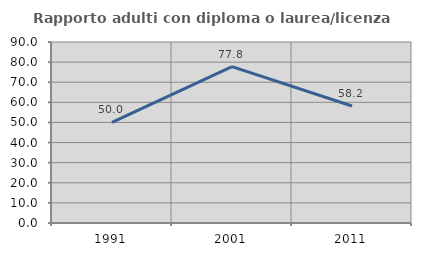
| Category | Rapporto adulti con diploma o laurea/licenza media  |
|---|---|
| 1991.0 | 50 |
| 2001.0 | 77.778 |
| 2011.0 | 58.182 |